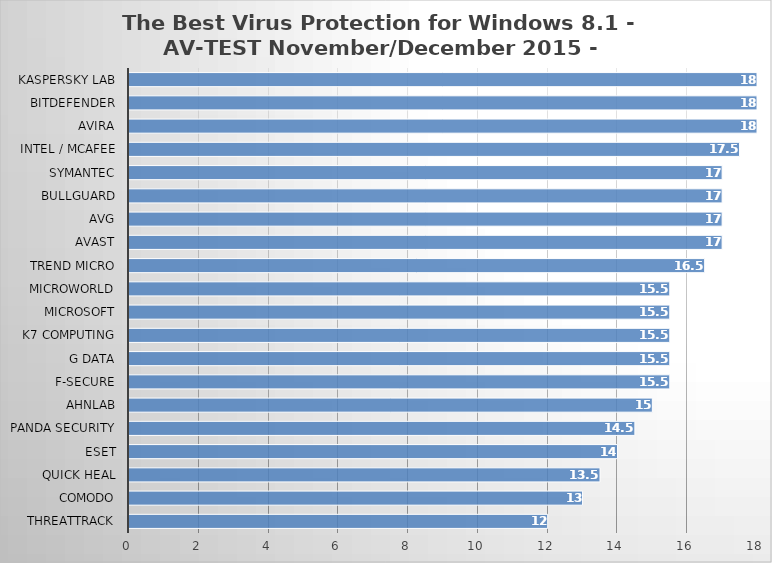
| Category | Series 0 |
|---|---|
| ThreatTrack | 12 |
| Comodo | 13 |
| Quick Heal | 13.5 |
| ESET | 14 |
| Panda Security | 14.5 |
| AhnLab | 15 |
| F-Secure | 15.5 |
| G Data | 15.5 |
| K7 Computing | 15.5 |
| Microsoft | 15.5 |
| Microworld | 15.5 |
| Trend Micro | 16.5 |
| Avast | 17 |
| AVG | 17 |
| BullGuard | 17 |
| Symantec | 17 |
| Intel / McAfee | 17.5 |
| Avira | 18 |
| Bitdefender | 18 |
| Kaspersky Lab | 18 |